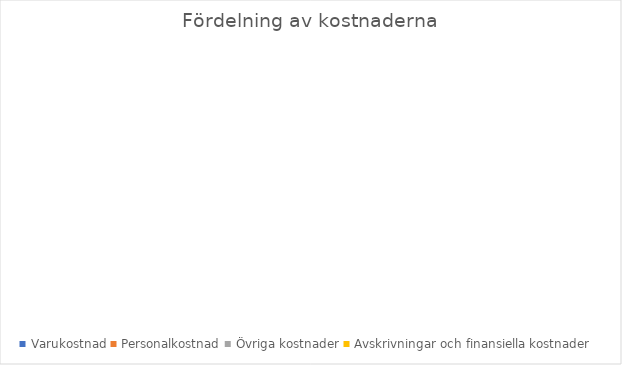
| Category | Series 0 |
|---|---|
| Varukostnad | 0 |
| Personalkostnad | 0 |
| Övriga kostnader | 0 |
| Avskrivningar och finansiella kostnader | 0 |